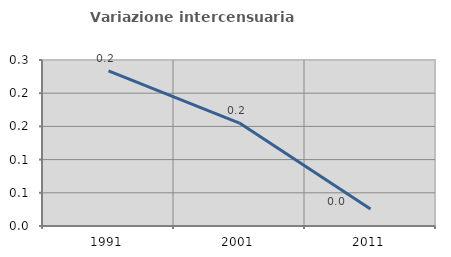
| Category | Variazione intercensuaria annua |
|---|---|
| 1991.0 | 0.234 |
| 2001.0 | 0.155 |
| 2011.0 | 0.026 |